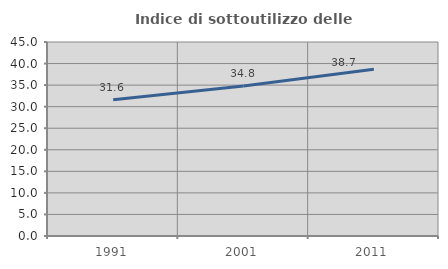
| Category | Indice di sottoutilizzo delle abitazioni  |
|---|---|
| 1991.0 | 31.603 |
| 2001.0 | 34.769 |
| 2011.0 | 38.668 |